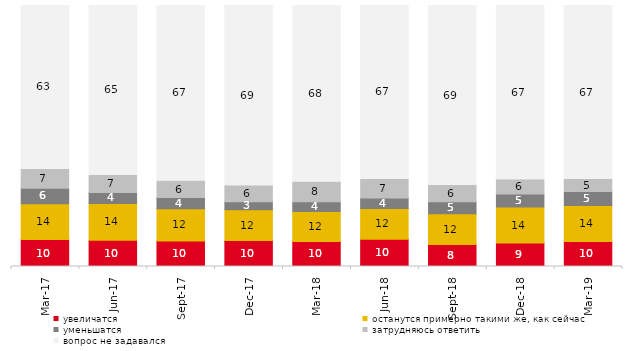
| Category | увеличатся | останутся примерно такими же, как сейчас | уменьшатся | затрудняюсь ответить | вопрос не задавался |
|---|---|---|---|---|---|
| 2017-03-01 | 10.3 | 13.75 | 5.95 | 7.2 | 62.8 |
| 2017-06-01 | 10.05 | 14.05 | 4.3 | 6.55 | 65.05 |
| 2017-09-01 | 9.8 | 12.3 | 4.3 | 6.4 | 67.2 |
| 2017-12-01 | 9.95 | 11.75 | 3.1 | 6.15 | 69.05 |
| 2018-03-01 | 9.6 | 11.5 | 3.75 | 7.5 | 67.65 |
| 2018-06-01 | 10.45 | 11.75 | 4.05 | 7.2 | 66.55 |
| 2018-09-01 | 8.45 | 11.8 | 4.6 | 6.15 | 69 |
| 2018-12-01 | 9.05 | 13.7 | 5 | 5.5 | 66.75 |
| 2019-03-01 | 9.597 | 13.774 | 5.321 | 4.625 | 66.683 |